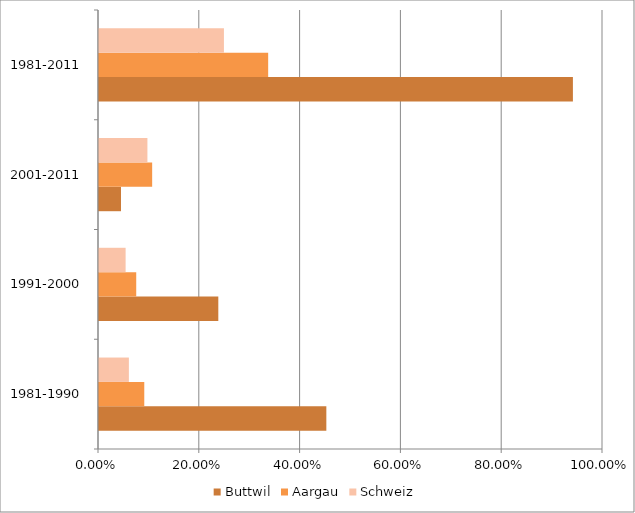
| Category | Buttwil | Aargau | Schweiz |
|---|---|---|---|
| 1981-1990 | 0.451 | 0.09 | 0.059 |
| 1991-2000 | 0.237 | 0.074 | 0.053 |
| 2001-2011 | 0.044 | 0.105 | 0.096 |
| 1981-2011 | 0.94 | 0.336 | 0.248 |